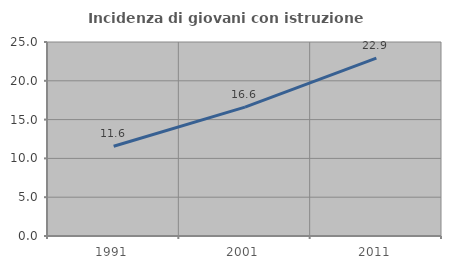
| Category | Incidenza di giovani con istruzione universitaria |
|---|---|
| 1991.0 | 11.567 |
| 2001.0 | 16.616 |
| 2011.0 | 22.922 |